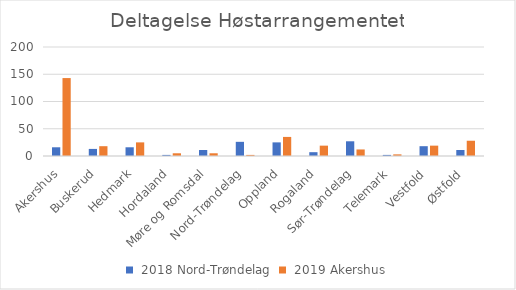
| Category | Fylkesoversikt Høstarrangementet |
|---|---|
| Akershus | 143 |
| Buskerud | 18 |
| Hedmark | 25 |
| Hordaland | 5 |
| Møre og Romsdal | 5 |
| Nord-Trøndelag | 2 |
| Oppland | 35 |
| Rogaland | 19 |
| Sør-Trøndelag | 12 |
| Telemark | 3 |
| Vestfold | 19 |
| Østfold | 28 |